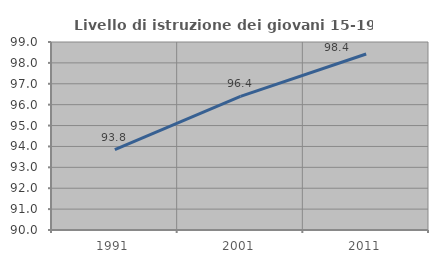
| Category | Livello di istruzione dei giovani 15-19 anni |
|---|---|
| 1991.0 | 93.846 |
| 2001.0 | 96.396 |
| 2011.0 | 98.425 |